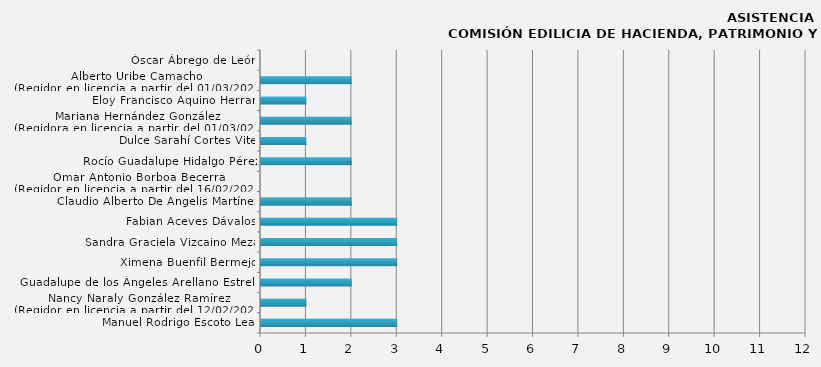
| Category | Manuel Rodrigo Escoto Leal |
|---|---|
| Manuel Rodrigo Escoto Leal | 3 |
| Nancy Naraly González Ramírez
(Regidor en licencia a partir del 12/02/2024) | 1 |
| Guadalupe de los Ángeles Arellano Estrella | 2 |
| Ximena Buenfil Bermejo | 3 |
| Sandra Graciela Vizcaino Meza | 3 |
| Fabian Aceves Dávalos | 3 |
| Claudio Alberto De Angelis Martínez | 2 |
| Omar Antonio Borboa Becerra
(Regidor en licencia a partir del 16/02/2024) | 0 |
| Rocío Guadalupe Hidalgo Pérez | 2 |
| Dulce Sarahí Cortes Vite | 1 |
| Mariana Hernández González
(Regidora en licencia a partir del 01/03/024) | 2 |
| Eloy Francisco Aquino Herran | 1 |
| Alberto Uribe Camacho
(Regidor en licencia a partir del 01/03/2024) | 2 |
| Óscar Ábrego de León | 0 |